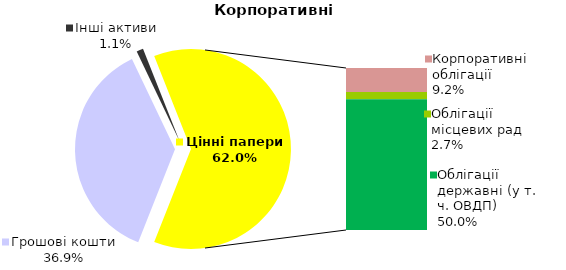
| Category | Корпоративні |
|---|---|
| Грошові кошти | 143.115 |
| Банківські метали | 0 |
| Нерухомість | 0 |
| Інші активи | 4.223 |
| Акції | 0 |
| Корпоративні облігації | 35.787 |
| Облігації місцевих рад | 10.643 |
| Облігації державні (у т. ч. ОВДП) | 193.946 |